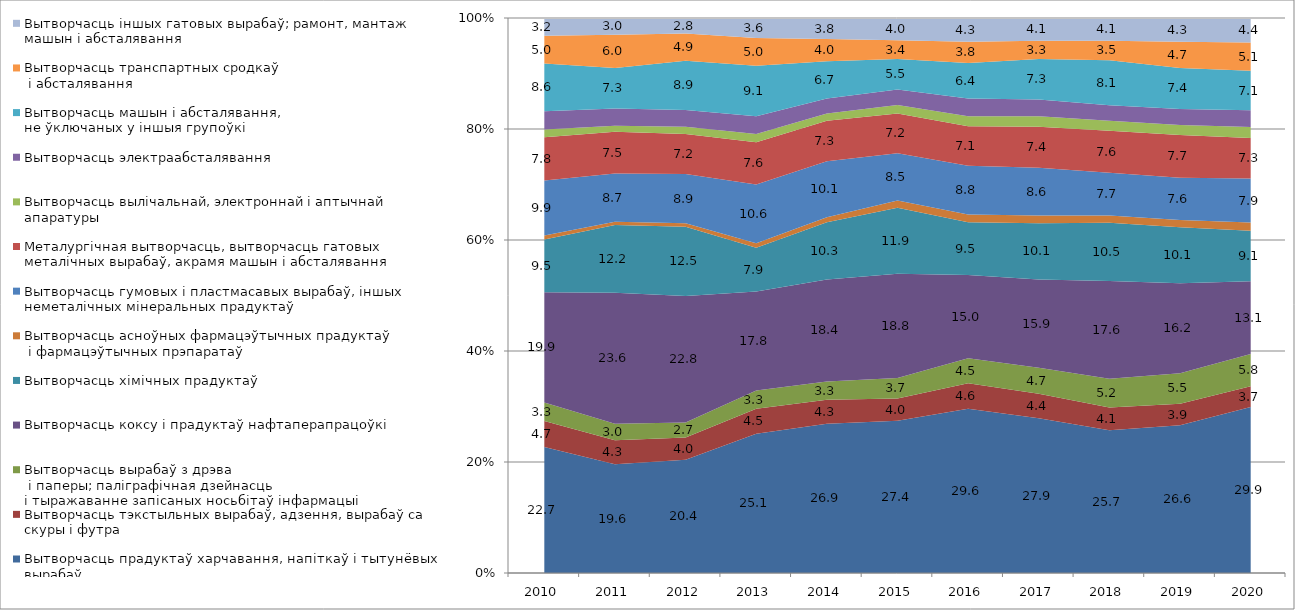
| Category | Вытворчасць прадуктаў харчавання, напіткаў і тытунёвых вырабаў | Вытворчасць тэкстыльных вырабаў, адзення, вырабаў са скуры і футра | Вытворчасць вырабаў з дрэва
 і паперы; паліграфічная дзейнасць 
і тыражаванне запісаных носьбітаў інфармацыі | Вытворчасць коксу і прадуктаў нафтаперапрацоўкі | Вытворчасць хімічных прадуктаў | Вытворчасць асноўных фармацэўтычных прадуктаў
 і фармацэўтычных прэпаратаў | Вытворчасць гумовых і пластмасавых вырабаў, іншых неметалічных мінеральных прадуктаў | Металургічная вытворчасць, вытворчасць гатовых металічных вырабаў, акрамя машын і абсталявання | Вытворчасць вылічальнай, электроннай і аптычнай апаратуры | Вытворчасць электраабсталявання | Вытворчасць машын і абсталявання, 
не ўключаных у іншыя групоўкі | Вытворчасць транспартных сродкаў
 і абсталявання | Вытворчасць іншых гатовых вырабаў; рамонт, мантаж машын і абсталявання |
|---|---|---|---|---|---|---|---|---|---|---|---|---|---|
| 0 | 22.7 | 4.7 | 3.3 | 19.9 | 9.5 | 0.7 | 9.9 | 7.8 | 1.4 | 3.3 | 8.6 | 5 | 3.2 |
| 1 | 19.6 | 4.3 | 3 | 23.6 | 12.2 | 0.6 | 8.7 | 7.5 | 1.1 | 3.1 | 7.3 | 6 | 3 |
| 2 | 20.41 | 4 | 2.7 | 22.8 | 12.5 | 0.6 | 8.9 | 7.2 | 1.3 | 3 | 8.9 | 4.9 | 2.8 |
| 3 | 25.1 | 4.5 | 3.3 | 17.8 | 7.9 | 0.8 | 10.6 | 7.6 | 1.5 | 3.2 | 9.1 | 5 | 3.6 |
| 4 | 26.9 | 4.3 | 3.3 | 18.4 | 10.3 | 0.9 | 10.1 | 7.3 | 1.3 | 2.7 | 6.7 | 4 | 3.8 |
| 5 | 27.44 | 4 | 3.7 | 18.8 | 11.9 | 1.3 | 8.5 | 7.2 | 1.5 | 2.8 | 5.5 | 3.4 | 4 |
| 6 | 29.58 | 4.6 | 4.5 | 15 | 9.5 | 1.4 | 8.8 | 7.1 | 1.8 | 3.2 | 6.4 | 3.8 | 4.3 |
| 7 | 27.9 | 4.4 | 4.7 | 15.9 | 10.1 | 1.4 | 8.6 | 7.4 | 1.9 | 3 | 7.3 | 3.3 | 4.1 |
| 8 | 25.7 | 4.1 | 5.2 | 17.6 | 10.5 | 1.3 | 7.7 | 7.6 | 1.8 | 2.8 | 8.1 | 3.5 | 4.1 |
| 9 | 26.6 | 3.9 | 5.5 | 16.2 | 10.1 | 1.3 | 7.6 | 7.7 | 1.8 | 2.9 | 7.4 | 4.7 | 4.3 |
| 10 | 29.9 | 3.7 | 5.8 | 13.1 | 9.1 | 1.5 | 7.9 | 7.3 | 2 | 3 | 7.1 | 5.1 | 4.4 |